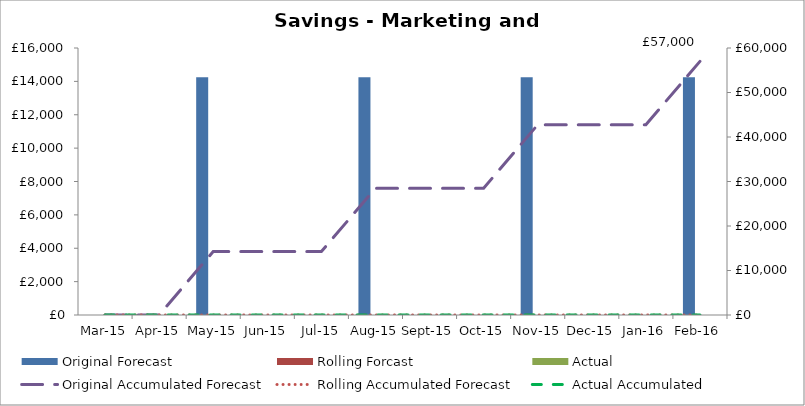
| Category | Original Forecast | Rolling Forcast | Actual |
|---|---|---|---|
| 2015-03-01 | 0 | 0 | 0 |
| 2015-04-01 | 0 | 0 | 0 |
| 2015-05-01 | 14250 | 0 | 0 |
| 2015-06-01 | 0 | 0 | 0 |
| 2015-07-01 | 0 | 0 | 0 |
| 2015-08-01 | 14250 | 0 | 0 |
| 2015-09-01 | 0 | 0 | 0 |
| 2015-10-01 | 0 | 0 | 0 |
| 2015-11-01 | 14250 | 0 | 0 |
| 2015-12-01 | 0 | 0 | 0 |
| 2016-01-01 | 0 | 0 | 0 |
| 2016-02-01 | 14250 | 0 | 0 |